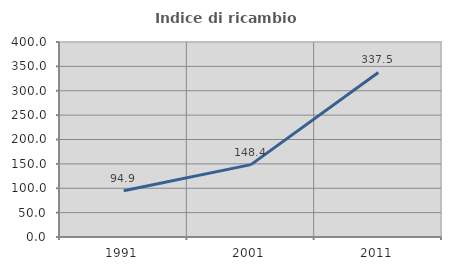
| Category | Indice di ricambio occupazionale  |
|---|---|
| 1991.0 | 94.885 |
| 2001.0 | 148.443 |
| 2011.0 | 337.5 |